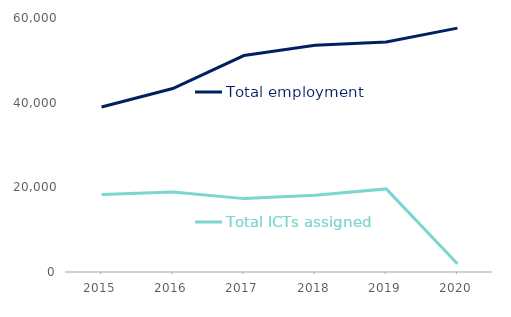
| Category | Total employment | Total ICTs assigned |
|---|---|---|
| 2015.0 | 38991 | 18297 |
| 2016.0 | 43333 | 18904 |
| 2017.0 | 51135 | 17334 |
| 2018.0 | 53555 | 18151 |
| 2019.0 | 54345 | 19633 |
| 2020.0 | 57610 | 1932 |